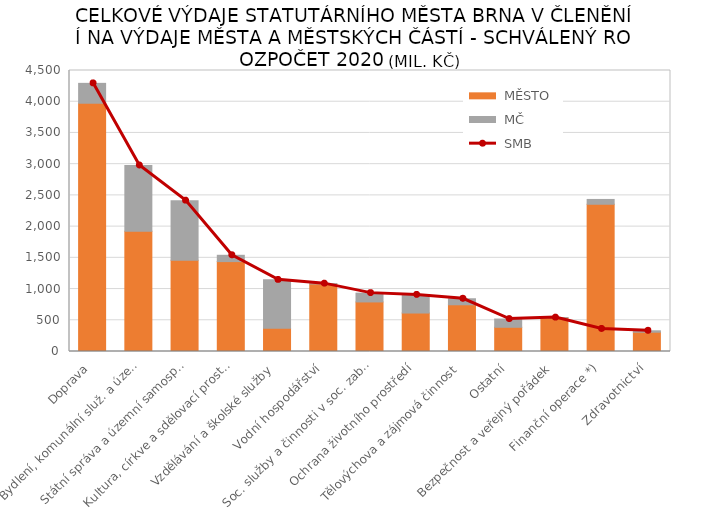
| Category |  MĚSTO |  MČ |
|---|---|---|
|  Doprava | 3975.839 | 318.217 |
|  Bydlení, komunální služ. a územ. rozvoj | 1925.062 | 1053.954 |
|  Státní správa a územní samospráva | 1460.647 | 955.384 |
|  Kultura, církve a sdělovací prostředky | 1439.802 | 100.876 |
|  Vzdělávání a školské služby | 373.72 | 773.515 |
|  Vodní hospodářství | 1081.243 | 5.466 |
|  Soc. služby a činnosti v soc. zabezpečení | 793.747 | 141.04 |
|  Ochrana životního prostředí | 616.1 | 290.22 |
|  Tělovýchova a zájmová činnost | 748.309 | 96.288 |
|  Ostatní | 387.913 | 131.831 |
|  Bezpečnost a veřejný pořádek | 541.079 | 1.78 |
|  Finanční operace *) | 2358.102 | 76.924 |
|  Zdravotnictví | 308.929 | 22.8 |